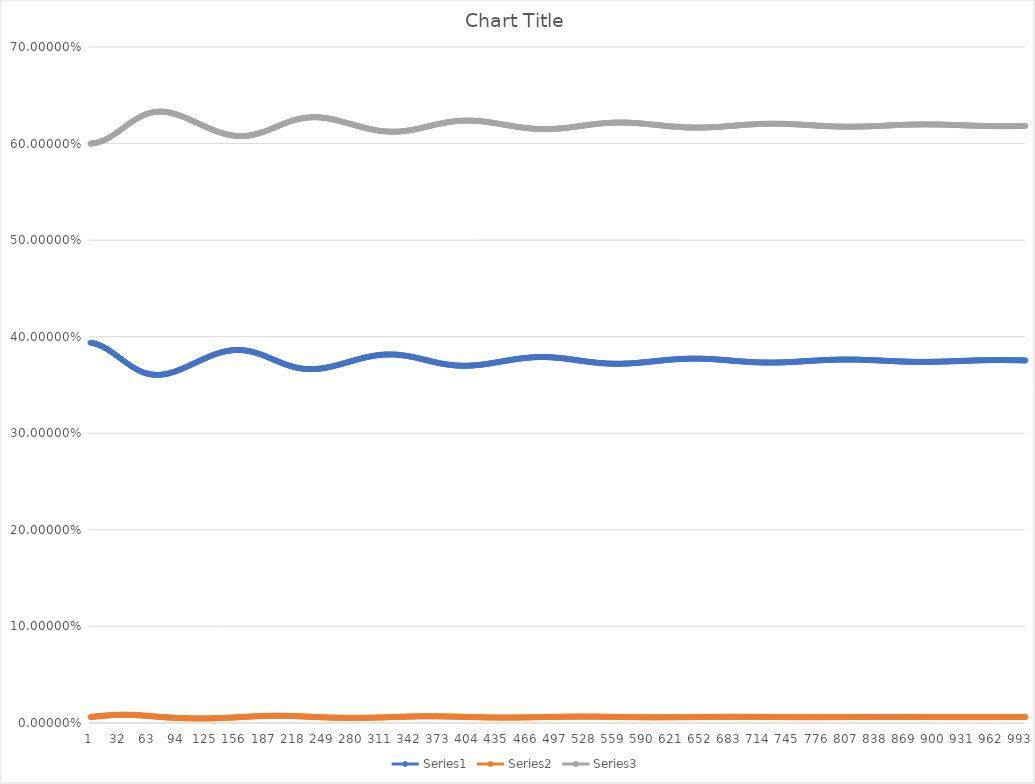
| Category | Series 0 | Series 1 | Series 2 |
|---|---|---|---|
| 0 | 0.394 | 0.006 | 0.6 |
| 1 | 0.394 | 0.006 | 0.6 |
| 2 | 0.393 | 0.006 | 0.6 |
| 3 | 0.393 | 0.006 | 0.6 |
| 4 | 0.393 | 0.007 | 0.6 |
| 5 | 0.393 | 0.007 | 0.601 |
| 6 | 0.392 | 0.007 | 0.601 |
| 7 | 0.392 | 0.007 | 0.601 |
| 8 | 0.392 | 0.007 | 0.601 |
| 9 | 0.391 | 0.007 | 0.602 |
| 10 | 0.391 | 0.007 | 0.602 |
| 11 | 0.391 | 0.007 | 0.602 |
| 12 | 0.39 | 0.007 | 0.603 |
| 13 | 0.39 | 0.007 | 0.603 |
| 14 | 0.389 | 0.007 | 0.603 |
| 15 | 0.389 | 0.008 | 0.604 |
| 16 | 0.388 | 0.008 | 0.604 |
| 17 | 0.388 | 0.008 | 0.605 |
| 18 | 0.387 | 0.008 | 0.605 |
| 19 | 0.386 | 0.008 | 0.606 |
| 20 | 0.386 | 0.008 | 0.606 |
| 21 | 0.385 | 0.008 | 0.607 |
| 22 | 0.385 | 0.008 | 0.607 |
| 23 | 0.384 | 0.008 | 0.608 |
| 24 | 0.383 | 0.008 | 0.609 |
| 25 | 0.382 | 0.008 | 0.609 |
| 26 | 0.382 | 0.008 | 0.61 |
| 27 | 0.381 | 0.008 | 0.611 |
| 28 | 0.38 | 0.008 | 0.611 |
| 29 | 0.38 | 0.008 | 0.612 |
| 30 | 0.379 | 0.008 | 0.613 |
| 31 | 0.378 | 0.008 | 0.613 |
| 32 | 0.377 | 0.009 | 0.614 |
| 33 | 0.377 | 0.009 | 0.615 |
| 34 | 0.376 | 0.009 | 0.615 |
| 35 | 0.375 | 0.009 | 0.616 |
| 36 | 0.375 | 0.009 | 0.617 |
| 37 | 0.374 | 0.009 | 0.618 |
| 38 | 0.373 | 0.009 | 0.618 |
| 39 | 0.372 | 0.009 | 0.619 |
| 40 | 0.372 | 0.009 | 0.62 |
| 41 | 0.371 | 0.008 | 0.62 |
| 42 | 0.37 | 0.008 | 0.621 |
| 43 | 0.37 | 0.008 | 0.622 |
| 44 | 0.369 | 0.008 | 0.622 |
| 45 | 0.369 | 0.008 | 0.623 |
| 46 | 0.368 | 0.008 | 0.624 |
| 47 | 0.367 | 0.008 | 0.624 |
| 48 | 0.367 | 0.008 | 0.625 |
| 49 | 0.366 | 0.008 | 0.626 |
| 50 | 0.366 | 0.008 | 0.626 |
| 51 | 0.365 | 0.008 | 0.627 |
| 52 | 0.365 | 0.008 | 0.627 |
| 53 | 0.364 | 0.008 | 0.628 |
| 54 | 0.364 | 0.008 | 0.628 |
| 55 | 0.364 | 0.008 | 0.629 |
| 56 | 0.363 | 0.008 | 0.629 |
| 57 | 0.363 | 0.008 | 0.63 |
| 58 | 0.363 | 0.008 | 0.63 |
| 59 | 0.362 | 0.007 | 0.63 |
| 60 | 0.362 | 0.007 | 0.631 |
| 61 | 0.362 | 0.007 | 0.631 |
| 62 | 0.361 | 0.007 | 0.631 |
| 63 | 0.361 | 0.007 | 0.632 |
| 64 | 0.361 | 0.007 | 0.632 |
| 65 | 0.361 | 0.007 | 0.632 |
| 66 | 0.361 | 0.007 | 0.632 |
| 67 | 0.361 | 0.007 | 0.632 |
| 68 | 0.361 | 0.007 | 0.633 |
| 69 | 0.361 | 0.007 | 0.633 |
| 70 | 0.361 | 0.007 | 0.633 |
| 71 | 0.36 | 0.007 | 0.633 |
| 72 | 0.361 | 0.006 | 0.633 |
| 73 | 0.361 | 0.006 | 0.633 |
| 74 | 0.361 | 0.006 | 0.633 |
| 75 | 0.361 | 0.006 | 0.633 |
| 76 | 0.361 | 0.006 | 0.633 |
| 77 | 0.361 | 0.006 | 0.633 |
| 78 | 0.361 | 0.006 | 0.633 |
| 79 | 0.361 | 0.006 | 0.633 |
| 80 | 0.361 | 0.006 | 0.633 |
| 81 | 0.362 | 0.006 | 0.633 |
| 82 | 0.362 | 0.006 | 0.632 |
| 83 | 0.362 | 0.006 | 0.632 |
| 84 | 0.362 | 0.006 | 0.632 |
| 85 | 0.362 | 0.006 | 0.632 |
| 86 | 0.363 | 0.006 | 0.632 |
| 87 | 0.363 | 0.005 | 0.631 |
| 88 | 0.363 | 0.005 | 0.631 |
| 89 | 0.364 | 0.005 | 0.631 |
| 90 | 0.364 | 0.005 | 0.631 |
| 91 | 0.364 | 0.005 | 0.63 |
| 92 | 0.365 | 0.005 | 0.63 |
| 93 | 0.365 | 0.005 | 0.63 |
| 94 | 0.365 | 0.005 | 0.629 |
| 95 | 0.366 | 0.005 | 0.629 |
| 96 | 0.366 | 0.005 | 0.629 |
| 97 | 0.367 | 0.005 | 0.628 |
| 98 | 0.367 | 0.005 | 0.628 |
| 99 | 0.367 | 0.005 | 0.628 |
| 100 | 0.368 | 0.005 | 0.627 |
| 101 | 0.368 | 0.005 | 0.627 |
| 102 | 0.369 | 0.005 | 0.626 |
| 103 | 0.369 | 0.005 | 0.626 |
| 104 | 0.37 | 0.005 | 0.626 |
| 105 | 0.37 | 0.005 | 0.625 |
| 106 | 0.37 | 0.005 | 0.625 |
| 107 | 0.371 | 0.005 | 0.624 |
| 108 | 0.371 | 0.005 | 0.624 |
| 109 | 0.372 | 0.005 | 0.623 |
| 110 | 0.372 | 0.005 | 0.623 |
| 111 | 0.373 | 0.005 | 0.623 |
| 112 | 0.373 | 0.005 | 0.622 |
| 113 | 0.374 | 0.005 | 0.622 |
| 114 | 0.374 | 0.005 | 0.621 |
| 115 | 0.375 | 0.005 | 0.621 |
| 116 | 0.375 | 0.005 | 0.62 |
| 117 | 0.375 | 0.005 | 0.62 |
| 118 | 0.376 | 0.005 | 0.619 |
| 119 | 0.376 | 0.005 | 0.619 |
| 120 | 0.377 | 0.005 | 0.619 |
| 121 | 0.377 | 0.005 | 0.618 |
| 122 | 0.378 | 0.005 | 0.618 |
| 123 | 0.378 | 0.005 | 0.617 |
| 124 | 0.378 | 0.005 | 0.617 |
| 125 | 0.379 | 0.005 | 0.616 |
| 126 | 0.379 | 0.005 | 0.616 |
| 127 | 0.38 | 0.005 | 0.616 |
| 128 | 0.38 | 0.005 | 0.615 |
| 129 | 0.38 | 0.005 | 0.615 |
| 130 | 0.381 | 0.005 | 0.614 |
| 131 | 0.381 | 0.005 | 0.614 |
| 132 | 0.382 | 0.005 | 0.614 |
| 133 | 0.382 | 0.005 | 0.613 |
| 134 | 0.382 | 0.005 | 0.613 |
| 135 | 0.383 | 0.005 | 0.612 |
| 136 | 0.383 | 0.005 | 0.612 |
| 137 | 0.383 | 0.005 | 0.612 |
| 138 | 0.383 | 0.005 | 0.611 |
| 139 | 0.384 | 0.005 | 0.611 |
| 140 | 0.384 | 0.005 | 0.611 |
| 141 | 0.384 | 0.005 | 0.611 |
| 142 | 0.384 | 0.005 | 0.61 |
| 143 | 0.385 | 0.005 | 0.61 |
| 144 | 0.385 | 0.005 | 0.61 |
| 145 | 0.385 | 0.005 | 0.61 |
| 146 | 0.385 | 0.005 | 0.609 |
| 147 | 0.385 | 0.005 | 0.609 |
| 148 | 0.386 | 0.005 | 0.609 |
| 149 | 0.386 | 0.006 | 0.609 |
| 150 | 0.386 | 0.006 | 0.609 |
| 151 | 0.386 | 0.006 | 0.608 |
| 152 | 0.386 | 0.006 | 0.608 |
| 153 | 0.386 | 0.006 | 0.608 |
| 154 | 0.386 | 0.006 | 0.608 |
| 155 | 0.386 | 0.006 | 0.608 |
| 156 | 0.386 | 0.006 | 0.608 |
| 157 | 0.386 | 0.006 | 0.608 |
| 158 | 0.386 | 0.006 | 0.608 |
| 159 | 0.386 | 0.006 | 0.608 |
| 160 | 0.386 | 0.006 | 0.608 |
| 161 | 0.386 | 0.006 | 0.608 |
| 162 | 0.386 | 0.006 | 0.608 |
| 163 | 0.386 | 0.006 | 0.608 |
| 164 | 0.386 | 0.006 | 0.608 |
| 165 | 0.386 | 0.006 | 0.608 |
| 166 | 0.386 | 0.006 | 0.608 |
| 167 | 0.385 | 0.006 | 0.608 |
| 168 | 0.385 | 0.007 | 0.608 |
| 169 | 0.385 | 0.007 | 0.608 |
| 170 | 0.385 | 0.007 | 0.608 |
| 171 | 0.385 | 0.007 | 0.609 |
| 172 | 0.384 | 0.007 | 0.609 |
| 173 | 0.384 | 0.007 | 0.609 |
| 174 | 0.384 | 0.007 | 0.609 |
| 175 | 0.384 | 0.007 | 0.609 |
| 176 | 0.383 | 0.007 | 0.61 |
| 177 | 0.383 | 0.007 | 0.61 |
| 178 | 0.383 | 0.007 | 0.61 |
| 179 | 0.382 | 0.007 | 0.61 |
| 180 | 0.382 | 0.007 | 0.611 |
| 181 | 0.382 | 0.007 | 0.611 |
| 182 | 0.381 | 0.007 | 0.611 |
| 183 | 0.381 | 0.007 | 0.612 |
| 184 | 0.381 | 0.007 | 0.612 |
| 185 | 0.38 | 0.007 | 0.612 |
| 186 | 0.38 | 0.007 | 0.613 |
| 187 | 0.38 | 0.007 | 0.613 |
| 188 | 0.379 | 0.007 | 0.613 |
| 189 | 0.379 | 0.007 | 0.614 |
| 190 | 0.378 | 0.007 | 0.614 |
| 191 | 0.378 | 0.007 | 0.615 |
| 192 | 0.378 | 0.007 | 0.615 |
| 193 | 0.377 | 0.007 | 0.615 |
| 194 | 0.377 | 0.007 | 0.616 |
| 195 | 0.376 | 0.008 | 0.616 |
| 196 | 0.376 | 0.008 | 0.617 |
| 197 | 0.375 | 0.008 | 0.617 |
| 198 | 0.375 | 0.008 | 0.617 |
| 199 | 0.375 | 0.008 | 0.618 |
| 200 | 0.374 | 0.008 | 0.618 |
| 201 | 0.374 | 0.008 | 0.619 |
| 202 | 0.373 | 0.008 | 0.619 |
| 203 | 0.373 | 0.007 | 0.619 |
| 204 | 0.373 | 0.007 | 0.62 |
| 205 | 0.372 | 0.007 | 0.62 |
| 206 | 0.372 | 0.007 | 0.621 |
| 207 | 0.372 | 0.007 | 0.621 |
| 208 | 0.371 | 0.007 | 0.621 |
| 209 | 0.371 | 0.007 | 0.622 |
| 210 | 0.371 | 0.007 | 0.622 |
| 211 | 0.37 | 0.007 | 0.622 |
| 212 | 0.37 | 0.007 | 0.623 |
| 213 | 0.37 | 0.007 | 0.623 |
| 214 | 0.369 | 0.007 | 0.623 |
| 215 | 0.369 | 0.007 | 0.624 |
| 216 | 0.369 | 0.007 | 0.624 |
| 217 | 0.369 | 0.007 | 0.624 |
| 218 | 0.368 | 0.007 | 0.625 |
| 219 | 0.368 | 0.007 | 0.625 |
| 220 | 0.368 | 0.007 | 0.625 |
| 221 | 0.368 | 0.007 | 0.625 |
| 222 | 0.368 | 0.007 | 0.625 |
| 223 | 0.367 | 0.007 | 0.626 |
| 224 | 0.367 | 0.007 | 0.626 |
| 225 | 0.367 | 0.007 | 0.626 |
| 226 | 0.367 | 0.007 | 0.626 |
| 227 | 0.367 | 0.007 | 0.626 |
| 228 | 0.367 | 0.007 | 0.627 |
| 229 | 0.367 | 0.007 | 0.627 |
| 230 | 0.367 | 0.007 | 0.627 |
| 231 | 0.367 | 0.007 | 0.627 |
| 232 | 0.366 | 0.007 | 0.627 |
| 233 | 0.366 | 0.006 | 0.627 |
| 234 | 0.366 | 0.006 | 0.627 |
| 235 | 0.366 | 0.006 | 0.627 |
| 236 | 0.366 | 0.006 | 0.627 |
| 237 | 0.366 | 0.006 | 0.627 |
| 238 | 0.366 | 0.006 | 0.627 |
| 239 | 0.367 | 0.006 | 0.627 |
| 240 | 0.367 | 0.006 | 0.627 |
| 241 | 0.367 | 0.006 | 0.627 |
| 242 | 0.367 | 0.006 | 0.627 |
| 243 | 0.367 | 0.006 | 0.627 |
| 244 | 0.367 | 0.006 | 0.627 |
| 245 | 0.367 | 0.006 | 0.627 |
| 246 | 0.367 | 0.006 | 0.627 |
| 247 | 0.367 | 0.006 | 0.627 |
| 248 | 0.367 | 0.006 | 0.627 |
| 249 | 0.368 | 0.006 | 0.627 |
| 250 | 0.368 | 0.006 | 0.626 |
| 251 | 0.368 | 0.006 | 0.626 |
| 252 | 0.368 | 0.006 | 0.626 |
| 253 | 0.368 | 0.006 | 0.626 |
| 254 | 0.369 | 0.006 | 0.626 |
| 255 | 0.369 | 0.006 | 0.626 |
| 256 | 0.369 | 0.006 | 0.625 |
| 257 | 0.369 | 0.006 | 0.625 |
| 258 | 0.369 | 0.006 | 0.625 |
| 259 | 0.37 | 0.006 | 0.625 |
| 260 | 0.37 | 0.006 | 0.625 |
| 261 | 0.37 | 0.005 | 0.624 |
| 262 | 0.37 | 0.005 | 0.624 |
| 263 | 0.371 | 0.005 | 0.624 |
| 264 | 0.371 | 0.005 | 0.624 |
| 265 | 0.371 | 0.005 | 0.623 |
| 266 | 0.371 | 0.005 | 0.623 |
| 267 | 0.372 | 0.005 | 0.623 |
| 268 | 0.372 | 0.005 | 0.623 |
| 269 | 0.372 | 0.005 | 0.622 |
| 270 | 0.372 | 0.005 | 0.622 |
| 271 | 0.373 | 0.005 | 0.622 |
| 272 | 0.373 | 0.005 | 0.622 |
| 273 | 0.373 | 0.005 | 0.621 |
| 274 | 0.374 | 0.005 | 0.621 |
| 275 | 0.374 | 0.005 | 0.621 |
| 276 | 0.374 | 0.005 | 0.621 |
| 277 | 0.374 | 0.005 | 0.62 |
| 278 | 0.375 | 0.005 | 0.62 |
| 279 | 0.375 | 0.005 | 0.62 |
| 280 | 0.375 | 0.005 | 0.619 |
| 281 | 0.376 | 0.005 | 0.619 |
| 282 | 0.376 | 0.005 | 0.619 |
| 283 | 0.376 | 0.005 | 0.619 |
| 284 | 0.376 | 0.005 | 0.618 |
| 285 | 0.377 | 0.005 | 0.618 |
| 286 | 0.377 | 0.005 | 0.618 |
| 287 | 0.377 | 0.005 | 0.618 |
| 288 | 0.377 | 0.005 | 0.617 |
| 289 | 0.378 | 0.005 | 0.617 |
| 290 | 0.378 | 0.005 | 0.617 |
| 291 | 0.378 | 0.005 | 0.617 |
| 292 | 0.378 | 0.005 | 0.616 |
| 293 | 0.379 | 0.005 | 0.616 |
| 294 | 0.379 | 0.005 | 0.616 |
| 295 | 0.379 | 0.005 | 0.616 |
| 296 | 0.379 | 0.005 | 0.615 |
| 297 | 0.379 | 0.005 | 0.615 |
| 298 | 0.38 | 0.005 | 0.615 |
| 299 | 0.38 | 0.005 | 0.615 |
| 300 | 0.38 | 0.006 | 0.615 |
| 301 | 0.38 | 0.006 | 0.614 |
| 302 | 0.38 | 0.006 | 0.614 |
| 303 | 0.38 | 0.006 | 0.614 |
| 304 | 0.381 | 0.006 | 0.614 |
| 305 | 0.381 | 0.006 | 0.614 |
| 306 | 0.381 | 0.006 | 0.614 |
| 307 | 0.381 | 0.006 | 0.613 |
| 308 | 0.381 | 0.006 | 0.613 |
| 309 | 0.381 | 0.006 | 0.613 |
| 310 | 0.381 | 0.006 | 0.613 |
| 311 | 0.381 | 0.006 | 0.613 |
| 312 | 0.381 | 0.006 | 0.613 |
| 313 | 0.381 | 0.006 | 0.613 |
| 314 | 0.382 | 0.006 | 0.613 |
| 315 | 0.382 | 0.006 | 0.613 |
| 316 | 0.382 | 0.006 | 0.612 |
| 317 | 0.382 | 0.006 | 0.612 |
| 318 | 0.382 | 0.006 | 0.612 |
| 319 | 0.382 | 0.006 | 0.612 |
| 320 | 0.382 | 0.006 | 0.612 |
| 321 | 0.382 | 0.006 | 0.612 |
| 322 | 0.382 | 0.006 | 0.612 |
| 323 | 0.382 | 0.006 | 0.612 |
| 324 | 0.382 | 0.006 | 0.612 |
| 325 | 0.381 | 0.006 | 0.612 |
| 326 | 0.381 | 0.006 | 0.612 |
| 327 | 0.381 | 0.006 | 0.612 |
| 328 | 0.381 | 0.006 | 0.612 |
| 329 | 0.381 | 0.006 | 0.612 |
| 330 | 0.381 | 0.006 | 0.613 |
| 331 | 0.381 | 0.006 | 0.613 |
| 332 | 0.381 | 0.006 | 0.613 |
| 333 | 0.381 | 0.006 | 0.613 |
| 334 | 0.381 | 0.007 | 0.613 |
| 335 | 0.38 | 0.007 | 0.613 |
| 336 | 0.38 | 0.007 | 0.613 |
| 337 | 0.38 | 0.007 | 0.613 |
| 338 | 0.38 | 0.007 | 0.613 |
| 339 | 0.38 | 0.007 | 0.614 |
| 340 | 0.38 | 0.007 | 0.614 |
| 341 | 0.379 | 0.007 | 0.614 |
| 342 | 0.379 | 0.007 | 0.614 |
| 343 | 0.379 | 0.007 | 0.614 |
| 344 | 0.379 | 0.007 | 0.614 |
| 345 | 0.379 | 0.007 | 0.615 |
| 346 | 0.378 | 0.007 | 0.615 |
| 347 | 0.378 | 0.007 | 0.615 |
| 348 | 0.378 | 0.007 | 0.615 |
| 349 | 0.378 | 0.007 | 0.615 |
| 350 | 0.378 | 0.007 | 0.616 |
| 351 | 0.377 | 0.007 | 0.616 |
| 352 | 0.377 | 0.007 | 0.616 |
| 353 | 0.377 | 0.007 | 0.616 |
| 354 | 0.377 | 0.007 | 0.616 |
| 355 | 0.376 | 0.007 | 0.617 |
| 356 | 0.376 | 0.007 | 0.617 |
| 357 | 0.376 | 0.007 | 0.617 |
| 358 | 0.376 | 0.007 | 0.617 |
| 359 | 0.375 | 0.007 | 0.618 |
| 360 | 0.375 | 0.007 | 0.618 |
| 361 | 0.375 | 0.007 | 0.618 |
| 362 | 0.375 | 0.007 | 0.618 |
| 363 | 0.374 | 0.007 | 0.619 |
| 364 | 0.374 | 0.007 | 0.619 |
| 365 | 0.374 | 0.007 | 0.619 |
| 366 | 0.374 | 0.007 | 0.619 |
| 367 | 0.374 | 0.007 | 0.619 |
| 368 | 0.373 | 0.007 | 0.62 |
| 369 | 0.373 | 0.007 | 0.62 |
| 370 | 0.373 | 0.007 | 0.62 |
| 371 | 0.373 | 0.007 | 0.62 |
| 372 | 0.373 | 0.007 | 0.621 |
| 373 | 0.372 | 0.007 | 0.621 |
| 374 | 0.372 | 0.007 | 0.621 |
| 375 | 0.372 | 0.007 | 0.621 |
| 376 | 0.372 | 0.007 | 0.621 |
| 377 | 0.372 | 0.007 | 0.622 |
| 378 | 0.372 | 0.007 | 0.622 |
| 379 | 0.371 | 0.007 | 0.622 |
| 380 | 0.371 | 0.007 | 0.622 |
| 381 | 0.371 | 0.007 | 0.622 |
| 382 | 0.371 | 0.007 | 0.622 |
| 383 | 0.371 | 0.007 | 0.622 |
| 384 | 0.371 | 0.007 | 0.623 |
| 385 | 0.371 | 0.007 | 0.623 |
| 386 | 0.371 | 0.007 | 0.623 |
| 387 | 0.37 | 0.007 | 0.623 |
| 388 | 0.37 | 0.007 | 0.623 |
| 389 | 0.37 | 0.007 | 0.623 |
| 390 | 0.37 | 0.007 | 0.623 |
| 391 | 0.37 | 0.006 | 0.623 |
| 392 | 0.37 | 0.006 | 0.623 |
| 393 | 0.37 | 0.006 | 0.624 |
| 394 | 0.37 | 0.006 | 0.624 |
| 395 | 0.37 | 0.006 | 0.624 |
| 396 | 0.37 | 0.006 | 0.624 |
| 397 | 0.37 | 0.006 | 0.624 |
| 398 | 0.37 | 0.006 | 0.624 |
| 399 | 0.37 | 0.006 | 0.624 |
| 400 | 0.37 | 0.006 | 0.624 |
| 401 | 0.37 | 0.006 | 0.624 |
| 402 | 0.37 | 0.006 | 0.624 |
| 403 | 0.37 | 0.006 | 0.624 |
| 404 | 0.37 | 0.006 | 0.624 |
| 405 | 0.37 | 0.006 | 0.624 |
| 406 | 0.37 | 0.006 | 0.624 |
| 407 | 0.37 | 0.006 | 0.624 |
| 408 | 0.37 | 0.006 | 0.624 |
| 409 | 0.37 | 0.006 | 0.624 |
| 410 | 0.37 | 0.006 | 0.624 |
| 411 | 0.371 | 0.006 | 0.623 |
| 412 | 0.371 | 0.006 | 0.623 |
| 413 | 0.371 | 0.006 | 0.623 |
| 414 | 0.371 | 0.006 | 0.623 |
| 415 | 0.371 | 0.006 | 0.623 |
| 416 | 0.371 | 0.006 | 0.623 |
| 417 | 0.371 | 0.006 | 0.623 |
| 418 | 0.371 | 0.006 | 0.623 |
| 419 | 0.371 | 0.006 | 0.623 |
| 420 | 0.372 | 0.006 | 0.623 |
| 421 | 0.372 | 0.006 | 0.623 |
| 422 | 0.372 | 0.006 | 0.622 |
| 423 | 0.372 | 0.006 | 0.622 |
| 424 | 0.372 | 0.006 | 0.622 |
| 425 | 0.372 | 0.006 | 0.622 |
| 426 | 0.372 | 0.006 | 0.622 |
| 427 | 0.373 | 0.006 | 0.622 |
| 428 | 0.373 | 0.006 | 0.622 |
| 429 | 0.373 | 0.006 | 0.621 |
| 430 | 0.373 | 0.006 | 0.621 |
| 431 | 0.373 | 0.006 | 0.621 |
| 432 | 0.373 | 0.006 | 0.621 |
| 433 | 0.374 | 0.006 | 0.621 |
| 434 | 0.374 | 0.006 | 0.621 |
| 435 | 0.374 | 0.006 | 0.62 |
| 436 | 0.374 | 0.006 | 0.62 |
| 437 | 0.374 | 0.006 | 0.62 |
| 438 | 0.374 | 0.006 | 0.62 |
| 439 | 0.375 | 0.006 | 0.62 |
| 440 | 0.375 | 0.006 | 0.62 |
| 441 | 0.375 | 0.006 | 0.619 |
| 442 | 0.375 | 0.006 | 0.619 |
| 443 | 0.375 | 0.006 | 0.619 |
| 444 | 0.375 | 0.006 | 0.619 |
| 445 | 0.376 | 0.006 | 0.619 |
| 446 | 0.376 | 0.006 | 0.619 |
| 447 | 0.376 | 0.006 | 0.618 |
| 448 | 0.376 | 0.006 | 0.618 |
| 449 | 0.376 | 0.006 | 0.618 |
| 450 | 0.376 | 0.006 | 0.618 |
| 451 | 0.376 | 0.006 | 0.618 |
| 452 | 0.377 | 0.006 | 0.618 |
| 453 | 0.377 | 0.006 | 0.618 |
| 454 | 0.377 | 0.006 | 0.617 |
| 455 | 0.377 | 0.006 | 0.617 |
| 456 | 0.377 | 0.006 | 0.617 |
| 457 | 0.377 | 0.006 | 0.617 |
| 458 | 0.377 | 0.006 | 0.617 |
| 459 | 0.378 | 0.006 | 0.617 |
| 460 | 0.378 | 0.006 | 0.617 |
| 461 | 0.378 | 0.006 | 0.616 |
| 462 | 0.378 | 0.006 | 0.616 |
| 463 | 0.378 | 0.006 | 0.616 |
| 464 | 0.378 | 0.006 | 0.616 |
| 465 | 0.378 | 0.006 | 0.616 |
| 466 | 0.378 | 0.006 | 0.616 |
| 467 | 0.378 | 0.006 | 0.616 |
| 468 | 0.378 | 0.006 | 0.616 |
| 469 | 0.378 | 0.006 | 0.616 |
| 470 | 0.379 | 0.006 | 0.616 |
| 471 | 0.379 | 0.006 | 0.615 |
| 472 | 0.379 | 0.006 | 0.615 |
| 473 | 0.379 | 0.006 | 0.615 |
| 474 | 0.379 | 0.006 | 0.615 |
| 475 | 0.379 | 0.006 | 0.615 |
| 476 | 0.379 | 0.006 | 0.615 |
| 477 | 0.379 | 0.006 | 0.615 |
| 478 | 0.379 | 0.006 | 0.615 |
| 479 | 0.379 | 0.006 | 0.615 |
| 480 | 0.379 | 0.006 | 0.615 |
| 481 | 0.379 | 0.006 | 0.615 |
| 482 | 0.379 | 0.006 | 0.615 |
| 483 | 0.379 | 0.006 | 0.615 |
| 484 | 0.379 | 0.006 | 0.615 |
| 485 | 0.379 | 0.006 | 0.615 |
| 486 | 0.379 | 0.006 | 0.615 |
| 487 | 0.379 | 0.006 | 0.615 |
| 488 | 0.379 | 0.006 | 0.615 |
| 489 | 0.379 | 0.006 | 0.615 |
| 490 | 0.379 | 0.006 | 0.615 |
| 491 | 0.379 | 0.006 | 0.615 |
| 492 | 0.379 | 0.006 | 0.615 |
| 493 | 0.379 | 0.006 | 0.615 |
| 494 | 0.378 | 0.006 | 0.615 |
| 495 | 0.378 | 0.006 | 0.615 |
| 496 | 0.378 | 0.006 | 0.615 |
| 497 | 0.378 | 0.006 | 0.615 |
| 498 | 0.378 | 0.006 | 0.615 |
| 499 | 0.378 | 0.006 | 0.616 |
| 500 | 0.378 | 0.006 | 0.616 |
| 501 | 0.378 | 0.006 | 0.616 |
| 502 | 0.378 | 0.006 | 0.616 |
| 503 | 0.378 | 0.006 | 0.616 |
| 504 | 0.378 | 0.006 | 0.616 |
| 505 | 0.377 | 0.007 | 0.616 |
| 506 | 0.377 | 0.007 | 0.616 |
| 507 | 0.377 | 0.007 | 0.616 |
| 508 | 0.377 | 0.007 | 0.616 |
| 509 | 0.377 | 0.007 | 0.617 |
| 510 | 0.377 | 0.007 | 0.617 |
| 511 | 0.377 | 0.007 | 0.617 |
| 512 | 0.377 | 0.007 | 0.617 |
| 513 | 0.376 | 0.007 | 0.617 |
| 514 | 0.376 | 0.007 | 0.617 |
| 515 | 0.376 | 0.007 | 0.617 |
| 516 | 0.376 | 0.007 | 0.617 |
| 517 | 0.376 | 0.007 | 0.618 |
| 518 | 0.376 | 0.007 | 0.618 |
| 519 | 0.376 | 0.007 | 0.618 |
| 520 | 0.375 | 0.007 | 0.618 |
| 521 | 0.375 | 0.007 | 0.618 |
| 522 | 0.375 | 0.007 | 0.618 |
| 523 | 0.375 | 0.007 | 0.618 |
| 524 | 0.375 | 0.007 | 0.618 |
| 525 | 0.375 | 0.007 | 0.619 |
| 526 | 0.375 | 0.007 | 0.619 |
| 527 | 0.375 | 0.007 | 0.619 |
| 528 | 0.374 | 0.007 | 0.619 |
| 529 | 0.374 | 0.007 | 0.619 |
| 530 | 0.374 | 0.007 | 0.619 |
| 531 | 0.374 | 0.007 | 0.619 |
| 532 | 0.374 | 0.007 | 0.62 |
| 533 | 0.374 | 0.007 | 0.62 |
| 534 | 0.374 | 0.007 | 0.62 |
| 535 | 0.374 | 0.007 | 0.62 |
| 536 | 0.373 | 0.007 | 0.62 |
| 537 | 0.373 | 0.007 | 0.62 |
| 538 | 0.373 | 0.007 | 0.62 |
| 539 | 0.373 | 0.007 | 0.62 |
| 540 | 0.373 | 0.007 | 0.62 |
| 541 | 0.373 | 0.007 | 0.621 |
| 542 | 0.373 | 0.007 | 0.621 |
| 543 | 0.373 | 0.007 | 0.621 |
| 544 | 0.373 | 0.007 | 0.621 |
| 545 | 0.373 | 0.006 | 0.621 |
| 546 | 0.373 | 0.006 | 0.621 |
| 547 | 0.372 | 0.006 | 0.621 |
| 548 | 0.372 | 0.006 | 0.621 |
| 549 | 0.372 | 0.006 | 0.621 |
| 550 | 0.372 | 0.006 | 0.621 |
| 551 | 0.372 | 0.006 | 0.621 |
| 552 | 0.372 | 0.006 | 0.621 |
| 553 | 0.372 | 0.006 | 0.621 |
| 554 | 0.372 | 0.006 | 0.622 |
| 555 | 0.372 | 0.006 | 0.622 |
| 556 | 0.372 | 0.006 | 0.622 |
| 557 | 0.372 | 0.006 | 0.622 |
| 558 | 0.372 | 0.006 | 0.622 |
| 559 | 0.372 | 0.006 | 0.622 |
| 560 | 0.372 | 0.006 | 0.622 |
| 561 | 0.372 | 0.006 | 0.622 |
| 562 | 0.372 | 0.006 | 0.622 |
| 563 | 0.372 | 0.006 | 0.622 |
| 564 | 0.372 | 0.006 | 0.622 |
| 565 | 0.372 | 0.006 | 0.622 |
| 566 | 0.372 | 0.006 | 0.622 |
| 567 | 0.372 | 0.006 | 0.622 |
| 568 | 0.372 | 0.006 | 0.622 |
| 569 | 0.372 | 0.006 | 0.622 |
| 570 | 0.372 | 0.006 | 0.622 |
| 571 | 0.372 | 0.006 | 0.622 |
| 572 | 0.372 | 0.006 | 0.622 |
| 573 | 0.372 | 0.006 | 0.622 |
| 574 | 0.372 | 0.006 | 0.622 |
| 575 | 0.372 | 0.006 | 0.622 |
| 576 | 0.372 | 0.006 | 0.621 |
| 577 | 0.373 | 0.006 | 0.621 |
| 578 | 0.373 | 0.006 | 0.621 |
| 579 | 0.373 | 0.006 | 0.621 |
| 580 | 0.373 | 0.006 | 0.621 |
| 581 | 0.373 | 0.006 | 0.621 |
| 582 | 0.373 | 0.006 | 0.621 |
| 583 | 0.373 | 0.006 | 0.621 |
| 584 | 0.373 | 0.006 | 0.621 |
| 585 | 0.373 | 0.006 | 0.621 |
| 586 | 0.373 | 0.006 | 0.621 |
| 587 | 0.373 | 0.006 | 0.621 |
| 588 | 0.373 | 0.006 | 0.621 |
| 589 | 0.373 | 0.006 | 0.621 |
| 590 | 0.374 | 0.006 | 0.621 |
| 591 | 0.374 | 0.006 | 0.62 |
| 592 | 0.374 | 0.006 | 0.62 |
| 593 | 0.374 | 0.006 | 0.62 |
| 594 | 0.374 | 0.006 | 0.62 |
| 595 | 0.374 | 0.006 | 0.62 |
| 596 | 0.374 | 0.006 | 0.62 |
| 597 | 0.374 | 0.006 | 0.62 |
| 598 | 0.374 | 0.006 | 0.62 |
| 599 | 0.374 | 0.006 | 0.62 |
| 600 | 0.375 | 0.006 | 0.62 |
| 601 | 0.375 | 0.006 | 0.619 |
| 602 | 0.375 | 0.006 | 0.619 |
| 603 | 0.375 | 0.006 | 0.619 |
| 604 | 0.375 | 0.006 | 0.619 |
| 605 | 0.375 | 0.006 | 0.619 |
| 606 | 0.375 | 0.006 | 0.619 |
| 607 | 0.375 | 0.006 | 0.619 |
| 608 | 0.375 | 0.006 | 0.619 |
| 609 | 0.375 | 0.006 | 0.619 |
| 610 | 0.376 | 0.006 | 0.619 |
| 611 | 0.376 | 0.006 | 0.618 |
| 612 | 0.376 | 0.006 | 0.618 |
| 613 | 0.376 | 0.006 | 0.618 |
| 614 | 0.376 | 0.006 | 0.618 |
| 615 | 0.376 | 0.006 | 0.618 |
| 616 | 0.376 | 0.006 | 0.618 |
| 617 | 0.376 | 0.006 | 0.618 |
| 618 | 0.376 | 0.006 | 0.618 |
| 619 | 0.376 | 0.006 | 0.618 |
| 620 | 0.376 | 0.006 | 0.618 |
| 621 | 0.376 | 0.006 | 0.618 |
| 622 | 0.377 | 0.006 | 0.618 |
| 623 | 0.377 | 0.006 | 0.617 |
| 624 | 0.377 | 0.006 | 0.617 |
| 625 | 0.377 | 0.006 | 0.617 |
| 626 | 0.377 | 0.006 | 0.617 |
| 627 | 0.377 | 0.006 | 0.617 |
| 628 | 0.377 | 0.006 | 0.617 |
| 629 | 0.377 | 0.006 | 0.617 |
| 630 | 0.377 | 0.006 | 0.617 |
| 631 | 0.377 | 0.006 | 0.617 |
| 632 | 0.377 | 0.006 | 0.617 |
| 633 | 0.377 | 0.006 | 0.617 |
| 634 | 0.377 | 0.006 | 0.617 |
| 635 | 0.377 | 0.006 | 0.617 |
| 636 | 0.377 | 0.006 | 0.617 |
| 637 | 0.377 | 0.006 | 0.617 |
| 638 | 0.377 | 0.006 | 0.617 |
| 639 | 0.377 | 0.006 | 0.617 |
| 640 | 0.377 | 0.006 | 0.617 |
| 641 | 0.377 | 0.006 | 0.617 |
| 642 | 0.377 | 0.006 | 0.617 |
| 643 | 0.377 | 0.006 | 0.617 |
| 644 | 0.377 | 0.006 | 0.617 |
| 645 | 0.377 | 0.006 | 0.617 |
| 646 | 0.377 | 0.006 | 0.617 |
| 647 | 0.377 | 0.006 | 0.617 |
| 648 | 0.377 | 0.006 | 0.617 |
| 649 | 0.377 | 0.006 | 0.617 |
| 650 | 0.377 | 0.006 | 0.617 |
| 651 | 0.377 | 0.006 | 0.617 |
| 652 | 0.377 | 0.006 | 0.617 |
| 653 | 0.377 | 0.006 | 0.617 |
| 654 | 0.377 | 0.006 | 0.617 |
| 655 | 0.377 | 0.006 | 0.617 |
| 656 | 0.377 | 0.006 | 0.617 |
| 657 | 0.377 | 0.006 | 0.617 |
| 658 | 0.377 | 0.006 | 0.617 |
| 659 | 0.377 | 0.006 | 0.617 |
| 660 | 0.377 | 0.006 | 0.617 |
| 661 | 0.377 | 0.006 | 0.617 |
| 662 | 0.377 | 0.006 | 0.617 |
| 663 | 0.377 | 0.006 | 0.617 |
| 664 | 0.377 | 0.006 | 0.617 |
| 665 | 0.377 | 0.006 | 0.617 |
| 666 | 0.377 | 0.006 | 0.617 |
| 667 | 0.376 | 0.006 | 0.617 |
| 668 | 0.376 | 0.006 | 0.617 |
| 669 | 0.376 | 0.006 | 0.617 |
| 670 | 0.376 | 0.006 | 0.617 |
| 671 | 0.376 | 0.006 | 0.617 |
| 672 | 0.376 | 0.006 | 0.618 |
| 673 | 0.376 | 0.006 | 0.618 |
| 674 | 0.376 | 0.006 | 0.618 |
| 675 | 0.376 | 0.006 | 0.618 |
| 676 | 0.376 | 0.006 | 0.618 |
| 677 | 0.376 | 0.006 | 0.618 |
| 678 | 0.376 | 0.006 | 0.618 |
| 679 | 0.376 | 0.006 | 0.618 |
| 680 | 0.375 | 0.006 | 0.618 |
| 681 | 0.375 | 0.006 | 0.618 |
| 682 | 0.375 | 0.006 | 0.618 |
| 683 | 0.375 | 0.006 | 0.618 |
| 684 | 0.375 | 0.006 | 0.618 |
| 685 | 0.375 | 0.006 | 0.618 |
| 686 | 0.375 | 0.006 | 0.619 |
| 687 | 0.375 | 0.006 | 0.619 |
| 688 | 0.375 | 0.006 | 0.619 |
| 689 | 0.375 | 0.006 | 0.619 |
| 690 | 0.375 | 0.006 | 0.619 |
| 691 | 0.375 | 0.006 | 0.619 |
| 692 | 0.375 | 0.006 | 0.619 |
| 693 | 0.374 | 0.006 | 0.619 |
| 694 | 0.374 | 0.006 | 0.619 |
| 695 | 0.374 | 0.006 | 0.619 |
| 696 | 0.374 | 0.006 | 0.619 |
| 697 | 0.374 | 0.006 | 0.619 |
| 698 | 0.374 | 0.006 | 0.619 |
| 699 | 0.374 | 0.006 | 0.62 |
| 700 | 0.374 | 0.006 | 0.62 |
| 701 | 0.374 | 0.006 | 0.62 |
| 702 | 0.374 | 0.006 | 0.62 |
| 703 | 0.374 | 0.006 | 0.62 |
| 704 | 0.374 | 0.006 | 0.62 |
| 705 | 0.374 | 0.006 | 0.62 |
| 706 | 0.374 | 0.006 | 0.62 |
| 707 | 0.374 | 0.006 | 0.62 |
| 708 | 0.374 | 0.006 | 0.62 |
| 709 | 0.374 | 0.006 | 0.62 |
| 710 | 0.373 | 0.006 | 0.62 |
| 711 | 0.373 | 0.006 | 0.62 |
| 712 | 0.373 | 0.006 | 0.62 |
| 713 | 0.373 | 0.006 | 0.62 |
| 714 | 0.373 | 0.006 | 0.62 |
| 715 | 0.373 | 0.006 | 0.62 |
| 716 | 0.373 | 0.006 | 0.62 |
| 717 | 0.373 | 0.006 | 0.62 |
| 718 | 0.373 | 0.006 | 0.62 |
| 719 | 0.373 | 0.006 | 0.62 |
| 720 | 0.373 | 0.006 | 0.62 |
| 721 | 0.373 | 0.006 | 0.621 |
| 722 | 0.373 | 0.006 | 0.621 |
| 723 | 0.373 | 0.006 | 0.621 |
| 724 | 0.373 | 0.006 | 0.621 |
| 725 | 0.373 | 0.006 | 0.621 |
| 726 | 0.373 | 0.006 | 0.621 |
| 727 | 0.373 | 0.006 | 0.621 |
| 728 | 0.373 | 0.006 | 0.621 |
| 729 | 0.373 | 0.006 | 0.621 |
| 730 | 0.373 | 0.006 | 0.621 |
| 731 | 0.373 | 0.006 | 0.621 |
| 732 | 0.373 | 0.006 | 0.621 |
| 733 | 0.373 | 0.006 | 0.621 |
| 734 | 0.373 | 0.006 | 0.621 |
| 735 | 0.373 | 0.006 | 0.62 |
| 736 | 0.373 | 0.006 | 0.62 |
| 737 | 0.373 | 0.006 | 0.62 |
| 738 | 0.373 | 0.006 | 0.62 |
| 739 | 0.374 | 0.006 | 0.62 |
| 740 | 0.374 | 0.006 | 0.62 |
| 741 | 0.374 | 0.006 | 0.62 |
| 742 | 0.374 | 0.006 | 0.62 |
| 743 | 0.374 | 0.006 | 0.62 |
| 744 | 0.374 | 0.006 | 0.62 |
| 745 | 0.374 | 0.006 | 0.62 |
| 746 | 0.374 | 0.006 | 0.62 |
| 747 | 0.374 | 0.006 | 0.62 |
| 748 | 0.374 | 0.006 | 0.62 |
| 749 | 0.374 | 0.006 | 0.62 |
| 750 | 0.374 | 0.006 | 0.62 |
| 751 | 0.374 | 0.006 | 0.62 |
| 752 | 0.374 | 0.006 | 0.62 |
| 753 | 0.374 | 0.006 | 0.62 |
| 754 | 0.374 | 0.006 | 0.62 |
| 755 | 0.374 | 0.006 | 0.62 |
| 756 | 0.374 | 0.006 | 0.62 |
| 757 | 0.374 | 0.006 | 0.62 |
| 758 | 0.374 | 0.006 | 0.62 |
| 759 | 0.375 | 0.006 | 0.619 |
| 760 | 0.375 | 0.006 | 0.619 |
| 761 | 0.375 | 0.006 | 0.619 |
| 762 | 0.375 | 0.006 | 0.619 |
| 763 | 0.375 | 0.006 | 0.619 |
| 764 | 0.375 | 0.006 | 0.619 |
| 765 | 0.375 | 0.006 | 0.619 |
| 766 | 0.375 | 0.006 | 0.619 |
| 767 | 0.375 | 0.006 | 0.619 |
| 768 | 0.375 | 0.006 | 0.619 |
| 769 | 0.375 | 0.006 | 0.619 |
| 770 | 0.375 | 0.006 | 0.619 |
| 771 | 0.375 | 0.006 | 0.619 |
| 772 | 0.375 | 0.006 | 0.619 |
| 773 | 0.375 | 0.006 | 0.619 |
| 774 | 0.375 | 0.006 | 0.619 |
| 775 | 0.375 | 0.006 | 0.619 |
| 776 | 0.376 | 0.006 | 0.618 |
| 777 | 0.376 | 0.006 | 0.618 |
| 778 | 0.376 | 0.006 | 0.618 |
| 779 | 0.376 | 0.006 | 0.618 |
| 780 | 0.376 | 0.006 | 0.618 |
| 781 | 0.376 | 0.006 | 0.618 |
| 782 | 0.376 | 0.006 | 0.618 |
| 783 | 0.376 | 0.006 | 0.618 |
| 784 | 0.376 | 0.006 | 0.618 |
| 785 | 0.376 | 0.006 | 0.618 |
| 786 | 0.376 | 0.006 | 0.618 |
| 787 | 0.376 | 0.006 | 0.618 |
| 788 | 0.376 | 0.006 | 0.618 |
| 789 | 0.376 | 0.006 | 0.618 |
| 790 | 0.376 | 0.006 | 0.618 |
| 791 | 0.376 | 0.006 | 0.618 |
| 792 | 0.376 | 0.006 | 0.618 |
| 793 | 0.376 | 0.006 | 0.618 |
| 794 | 0.376 | 0.006 | 0.618 |
| 795 | 0.376 | 0.006 | 0.618 |
| 796 | 0.376 | 0.006 | 0.618 |
| 797 | 0.376 | 0.006 | 0.618 |
| 798 | 0.376 | 0.006 | 0.618 |
| 799 | 0.376 | 0.006 | 0.618 |
| 800 | 0.376 | 0.006 | 0.618 |
| 801 | 0.376 | 0.006 | 0.618 |
| 802 | 0.376 | 0.006 | 0.618 |
| 803 | 0.376 | 0.006 | 0.618 |
| 804 | 0.376 | 0.006 | 0.617 |
| 805 | 0.376 | 0.006 | 0.617 |
| 806 | 0.376 | 0.006 | 0.617 |
| 807 | 0.376 | 0.006 | 0.617 |
| 808 | 0.376 | 0.006 | 0.617 |
| 809 | 0.376 | 0.006 | 0.617 |
| 810 | 0.376 | 0.006 | 0.617 |
| 811 | 0.376 | 0.006 | 0.617 |
| 812 | 0.376 | 0.006 | 0.617 |
| 813 | 0.376 | 0.006 | 0.617 |
| 814 | 0.376 | 0.006 | 0.617 |
| 815 | 0.376 | 0.006 | 0.618 |
| 816 | 0.376 | 0.006 | 0.618 |
| 817 | 0.376 | 0.006 | 0.618 |
| 818 | 0.376 | 0.006 | 0.618 |
| 819 | 0.376 | 0.006 | 0.618 |
| 820 | 0.376 | 0.006 | 0.618 |
| 821 | 0.376 | 0.006 | 0.618 |
| 822 | 0.376 | 0.006 | 0.618 |
| 823 | 0.376 | 0.006 | 0.618 |
| 824 | 0.376 | 0.006 | 0.618 |
| 825 | 0.376 | 0.006 | 0.618 |
| 826 | 0.376 | 0.006 | 0.618 |
| 827 | 0.376 | 0.006 | 0.618 |
| 828 | 0.376 | 0.006 | 0.618 |
| 829 | 0.376 | 0.006 | 0.618 |
| 830 | 0.376 | 0.006 | 0.618 |
| 831 | 0.376 | 0.006 | 0.618 |
| 832 | 0.376 | 0.006 | 0.618 |
| 833 | 0.376 | 0.006 | 0.618 |
| 834 | 0.376 | 0.006 | 0.618 |
| 835 | 0.376 | 0.006 | 0.618 |
| 836 | 0.376 | 0.006 | 0.618 |
| 837 | 0.376 | 0.006 | 0.618 |
| 838 | 0.375 | 0.006 | 0.618 |
| 839 | 0.375 | 0.006 | 0.618 |
| 840 | 0.375 | 0.006 | 0.618 |
| 841 | 0.375 | 0.006 | 0.618 |
| 842 | 0.375 | 0.006 | 0.618 |
| 843 | 0.375 | 0.006 | 0.618 |
| 844 | 0.375 | 0.006 | 0.618 |
| 845 | 0.375 | 0.006 | 0.619 |
| 846 | 0.375 | 0.006 | 0.619 |
| 847 | 0.375 | 0.006 | 0.619 |
| 848 | 0.375 | 0.006 | 0.619 |
| 849 | 0.375 | 0.006 | 0.619 |
| 850 | 0.375 | 0.006 | 0.619 |
| 851 | 0.375 | 0.006 | 0.619 |
| 852 | 0.375 | 0.006 | 0.619 |
| 853 | 0.375 | 0.006 | 0.619 |
| 854 | 0.375 | 0.006 | 0.619 |
| 855 | 0.375 | 0.006 | 0.619 |
| 856 | 0.375 | 0.006 | 0.619 |
| 857 | 0.375 | 0.006 | 0.619 |
| 858 | 0.375 | 0.006 | 0.619 |
| 859 | 0.375 | 0.006 | 0.619 |
| 860 | 0.374 | 0.006 | 0.619 |
| 861 | 0.374 | 0.006 | 0.619 |
| 862 | 0.374 | 0.006 | 0.619 |
| 863 | 0.374 | 0.006 | 0.619 |
| 864 | 0.374 | 0.006 | 0.619 |
| 865 | 0.374 | 0.006 | 0.619 |
| 866 | 0.374 | 0.006 | 0.619 |
| 867 | 0.374 | 0.006 | 0.619 |
| 868 | 0.374 | 0.006 | 0.619 |
| 869 | 0.374 | 0.006 | 0.62 |
| 870 | 0.374 | 0.006 | 0.62 |
| 871 | 0.374 | 0.006 | 0.62 |
| 872 | 0.374 | 0.006 | 0.62 |
| 873 | 0.374 | 0.006 | 0.62 |
| 874 | 0.374 | 0.006 | 0.62 |
| 875 | 0.374 | 0.006 | 0.62 |
| 876 | 0.374 | 0.006 | 0.62 |
| 877 | 0.374 | 0.006 | 0.62 |
| 878 | 0.374 | 0.006 | 0.62 |
| 879 | 0.374 | 0.006 | 0.62 |
| 880 | 0.374 | 0.006 | 0.62 |
| 881 | 0.374 | 0.006 | 0.62 |
| 882 | 0.374 | 0.006 | 0.62 |
| 883 | 0.374 | 0.006 | 0.62 |
| 884 | 0.374 | 0.006 | 0.62 |
| 885 | 0.374 | 0.006 | 0.62 |
| 886 | 0.374 | 0.006 | 0.62 |
| 887 | 0.374 | 0.006 | 0.62 |
| 888 | 0.374 | 0.006 | 0.62 |
| 889 | 0.374 | 0.006 | 0.62 |
| 890 | 0.374 | 0.006 | 0.62 |
| 891 | 0.374 | 0.006 | 0.62 |
| 892 | 0.374 | 0.006 | 0.62 |
| 893 | 0.374 | 0.006 | 0.62 |
| 894 | 0.374 | 0.006 | 0.62 |
| 895 | 0.374 | 0.006 | 0.62 |
| 896 | 0.374 | 0.006 | 0.62 |
| 897 | 0.374 | 0.006 | 0.62 |
| 898 | 0.374 | 0.006 | 0.62 |
| 899 | 0.374 | 0.006 | 0.62 |
| 900 | 0.374 | 0.006 | 0.62 |
| 901 | 0.374 | 0.006 | 0.62 |
| 902 | 0.374 | 0.006 | 0.62 |
| 903 | 0.374 | 0.006 | 0.62 |
| 904 | 0.374 | 0.006 | 0.62 |
| 905 | 0.374 | 0.006 | 0.62 |
| 906 | 0.374 | 0.006 | 0.62 |
| 907 | 0.374 | 0.006 | 0.62 |
| 908 | 0.374 | 0.006 | 0.62 |
| 909 | 0.374 | 0.006 | 0.62 |
| 910 | 0.374 | 0.006 | 0.62 |
| 911 | 0.374 | 0.006 | 0.62 |
| 912 | 0.374 | 0.006 | 0.62 |
| 913 | 0.374 | 0.006 | 0.619 |
| 914 | 0.374 | 0.006 | 0.619 |
| 915 | 0.374 | 0.006 | 0.619 |
| 916 | 0.375 | 0.006 | 0.619 |
| 917 | 0.375 | 0.006 | 0.619 |
| 918 | 0.375 | 0.006 | 0.619 |
| 919 | 0.375 | 0.006 | 0.619 |
| 920 | 0.375 | 0.006 | 0.619 |
| 921 | 0.375 | 0.006 | 0.619 |
| 922 | 0.375 | 0.006 | 0.619 |
| 923 | 0.375 | 0.006 | 0.619 |
| 924 | 0.375 | 0.006 | 0.619 |
| 925 | 0.375 | 0.006 | 0.619 |
| 926 | 0.375 | 0.006 | 0.619 |
| 927 | 0.375 | 0.006 | 0.619 |
| 928 | 0.375 | 0.006 | 0.619 |
| 929 | 0.375 | 0.006 | 0.619 |
| 930 | 0.375 | 0.006 | 0.619 |
| 931 | 0.375 | 0.006 | 0.619 |
| 932 | 0.375 | 0.006 | 0.619 |
| 933 | 0.375 | 0.006 | 0.619 |
| 934 | 0.375 | 0.006 | 0.619 |
| 935 | 0.375 | 0.006 | 0.619 |
| 936 | 0.375 | 0.006 | 0.619 |
| 937 | 0.375 | 0.006 | 0.619 |
| 938 | 0.375 | 0.006 | 0.619 |
| 939 | 0.375 | 0.006 | 0.619 |
| 940 | 0.375 | 0.006 | 0.619 |
| 941 | 0.375 | 0.006 | 0.619 |
| 942 | 0.375 | 0.006 | 0.619 |
| 943 | 0.375 | 0.006 | 0.618 |
| 944 | 0.375 | 0.006 | 0.618 |
| 945 | 0.375 | 0.006 | 0.618 |
| 946 | 0.376 | 0.006 | 0.618 |
| 947 | 0.376 | 0.006 | 0.618 |
| 948 | 0.376 | 0.006 | 0.618 |
| 949 | 0.376 | 0.006 | 0.618 |
| 950 | 0.376 | 0.006 | 0.618 |
| 951 | 0.376 | 0.006 | 0.618 |
| 952 | 0.376 | 0.006 | 0.618 |
| 953 | 0.376 | 0.006 | 0.618 |
| 954 | 0.376 | 0.006 | 0.618 |
| 955 | 0.376 | 0.006 | 0.618 |
| 956 | 0.376 | 0.006 | 0.618 |
| 957 | 0.376 | 0.006 | 0.618 |
| 958 | 0.376 | 0.006 | 0.618 |
| 959 | 0.376 | 0.006 | 0.618 |
| 960 | 0.376 | 0.006 | 0.618 |
| 961 | 0.376 | 0.006 | 0.618 |
| 962 | 0.376 | 0.006 | 0.618 |
| 963 | 0.376 | 0.006 | 0.618 |
| 964 | 0.376 | 0.006 | 0.618 |
| 965 | 0.376 | 0.006 | 0.618 |
| 966 | 0.376 | 0.006 | 0.618 |
| 967 | 0.376 | 0.006 | 0.618 |
| 968 | 0.376 | 0.006 | 0.618 |
| 969 | 0.376 | 0.006 | 0.618 |
| 970 | 0.376 | 0.006 | 0.618 |
| 971 | 0.376 | 0.006 | 0.618 |
| 972 | 0.376 | 0.006 | 0.618 |
| 973 | 0.376 | 0.006 | 0.618 |
| 974 | 0.376 | 0.006 | 0.618 |
| 975 | 0.376 | 0.006 | 0.618 |
| 976 | 0.376 | 0.006 | 0.618 |
| 977 | 0.376 | 0.006 | 0.618 |
| 978 | 0.376 | 0.006 | 0.618 |
| 979 | 0.376 | 0.006 | 0.618 |
| 980 | 0.376 | 0.006 | 0.618 |
| 981 | 0.376 | 0.006 | 0.618 |
| 982 | 0.376 | 0.006 | 0.618 |
| 983 | 0.376 | 0.006 | 0.618 |
| 984 | 0.376 | 0.006 | 0.618 |
| 985 | 0.376 | 0.006 | 0.618 |
| 986 | 0.376 | 0.006 | 0.618 |
| 987 | 0.376 | 0.006 | 0.618 |
| 988 | 0.376 | 0.006 | 0.618 |
| 989 | 0.376 | 0.006 | 0.618 |
| 990 | 0.376 | 0.006 | 0.618 |
| 991 | 0.376 | 0.006 | 0.618 |
| 992 | 0.376 | 0.006 | 0.618 |
| 993 | 0.375 | 0.006 | 0.618 |
| 994 | 0.375 | 0.006 | 0.618 |
| 995 | 0.375 | 0.006 | 0.618 |
| 996 | 0.375 | 0.006 | 0.618 |